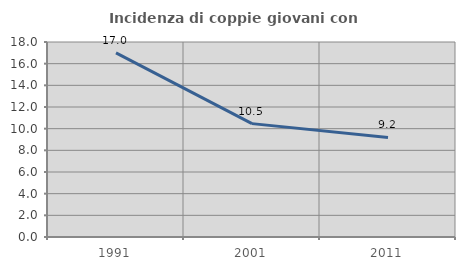
| Category | Incidenza di coppie giovani con figli |
|---|---|
| 1991.0 | 16.991 |
| 2001.0 | 10.466 |
| 2011.0 | 9.186 |